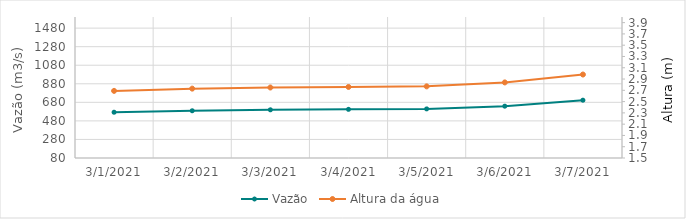
| Category | Vazão |
|---|---|
| 2/17/21 | 655.35 |
| 2/16/21 | 724.45 |
| 2/15/21 | 815.31 |
| 2/14/21 | 894.24 |
| 2/13/21 | 941.5 |
| 2/12/21 | 970.2 |
| 2/11/21 | 1004.08 |